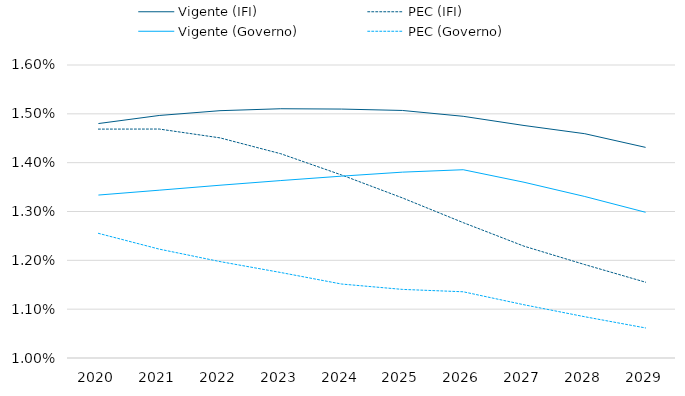
| Category | Vigente (IFI) | PEC (IFI) | Vigente (Governo) | PEC (Governo) |
|---|---|---|---|---|
| 2020.0 | 0.015 | 0.015 | 0.013 | 0.013 |
| 2021.0 | 0.015 | 0.015 | 0.013 | 0.012 |
| 2022.0 | 0.015 | 0.015 | 0.014 | 0.012 |
| 2023.0 | 0.015 | 0.014 | 0.014 | 0.012 |
| 2024.0 | 0.015 | 0.014 | 0.014 | 0.012 |
| 2025.0 | 0.015 | 0.013 | 0.014 | 0.011 |
| 2026.0 | 0.015 | 0.013 | 0.014 | 0.011 |
| 2027.0 | 0.015 | 0.012 | 0.014 | 0.011 |
| 2028.0 | 0.015 | 0.012 | 0.013 | 0.011 |
| 2029.0 | 0.014 | 0.012 | 0.013 | 0.011 |